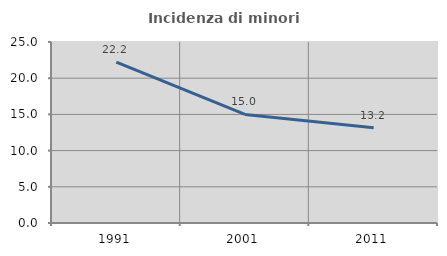
| Category | Incidenza di minori stranieri |
|---|---|
| 1991.0 | 22.222 |
| 2001.0 | 15 |
| 2011.0 | 13.158 |